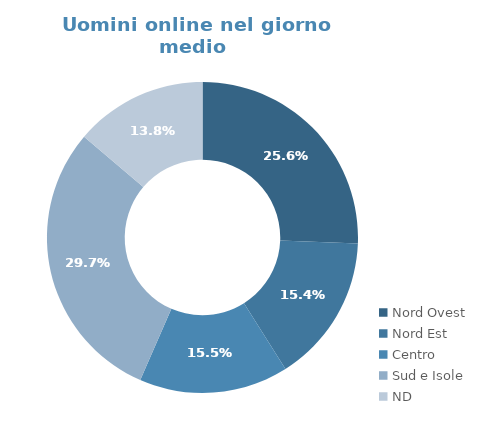
| Category | Series 0 |
|---|---|
| Nord Ovest | 0.256 |
| Nord Est | 0.154 |
| Centro | 0.155 |
| Sud e Isole | 0.297 |
| ND | 0.138 |